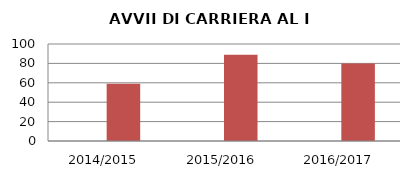
| Category | ANNO | NUMERO |
|---|---|---|
| 2014/2015 | 0 | 59 |
| 2015/2016 | 0 | 89 |
| 2016/2017 | 0 | 80 |